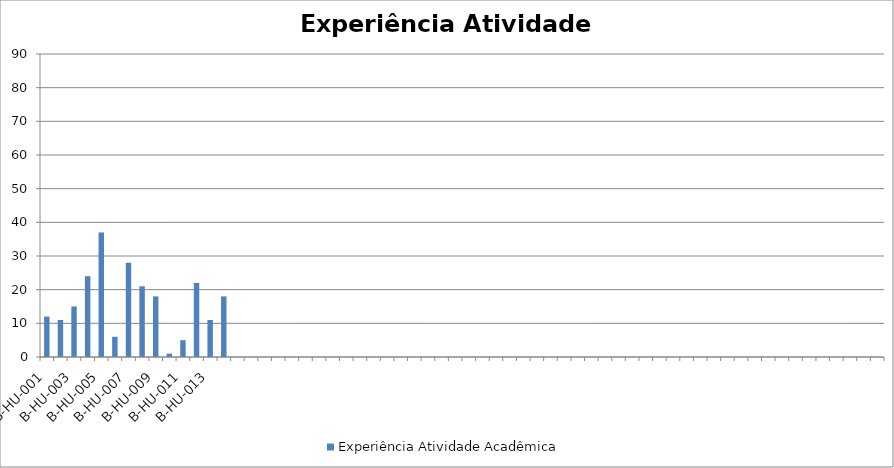
| Category | Experiência Atividade Acadêmica |
|---|---|
| B-HU-001 | 12 |
| B-HU-002 | 11 |
| B-HU-003 | 15 |
| B-HU-004 | 24 |
| B-HU-005 | 37 |
| B-HU-006 | 6 |
| B-HU-007 | 28 |
| B-HU-008 | 21 |
| B-HU-009 | 18 |
| B-HU-010 | 1 |
| B-HU-011 | 5 |
| B-HU-012 | 22 |
| B-HU-013 | 11 |
| B-HU-014 | 18 |